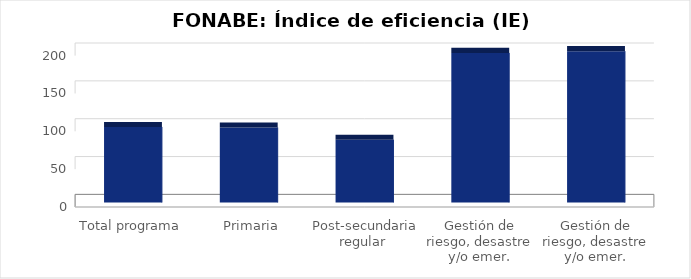
| Category | Índice de eficiencia (IE)  |
|---|---|
| Total programa | 99.873 |
|   Primaria | 99.135 |
| Post-secundaria regular  | 82.972 |
| Gestión de riesgo, desastre y/o emer. Primaria  | 197.672 |
| Gestión de riesgo, desastre y/o emer. Secundaria | 200 |